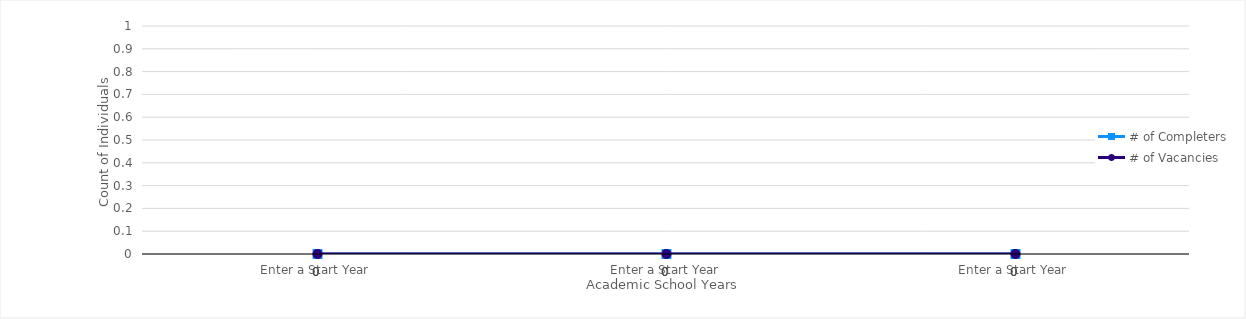
| Category | # of Completers | # of Vacancies |
|---|---|---|
| Enter a Start Year | 0 | 0 |
| Enter a Start Year | 0 | 0 |
| Enter a Start Year | 0 | 0 |